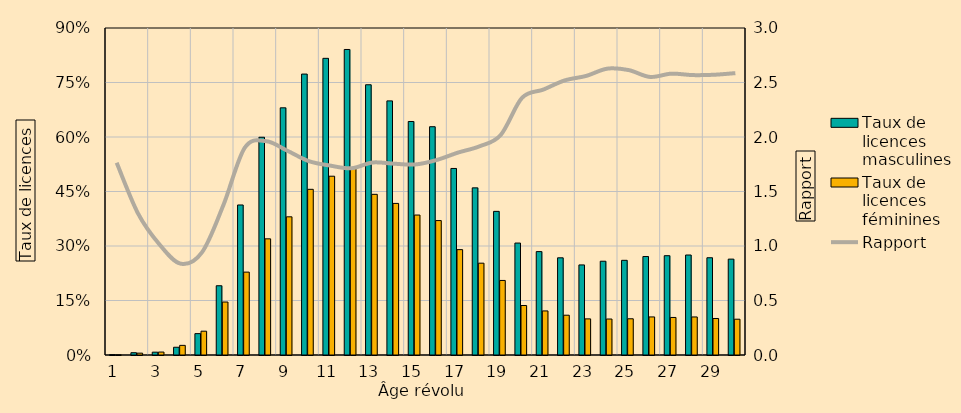
| Category | Taux de licences masculines | Taux de licences féminines |
|---|---|---|
| 0 | 0.1 | 0.06 |
| 1 | 0.63 | 0.51 |
| 2 | 0.78 | 0.81 |
| 3 | 2.13 | 2.65 |
| 4 | 5.88 | 6.55 |
| 5 | 19.06 | 14.58 |
| 6 | 41.29 | 22.81 |
| 7 | 59.93 | 31.97 |
| 8 | 68.03 | 38.03 |
| 9 | 77.32 | 45.6 |
| 10 | 81.65 | 49.21 |
| 11 | 84.09 | 51.43 |
| 12 | 74.38 | 44.22 |
| 13 | 69.94 | 41.72 |
| 14 | 64.27 | 38.52 |
| 15 | 62.83 | 37 |
| 16 | 51.34 | 29 |
| 17 | 46 | 25.27 |
| 18 | 39.53 | 20.52 |
| 19 | 30.81 | 13.62 |
| 20 | 28.46 | 12.13 |
| 21 | 26.75 | 10.95 |
| 22 | 24.79 | 9.94 |
| 23 | 25.81 | 9.9 |
| 24 | 26.06 | 9.97 |
| 25 | 27.1 | 10.48 |
| 26 | 27.33 | 10.33 |
| 27 | 27.52 | 10.47 |
| 28 | 26.77 | 10.05 |
| 29 | 26.39 | 9.85 |